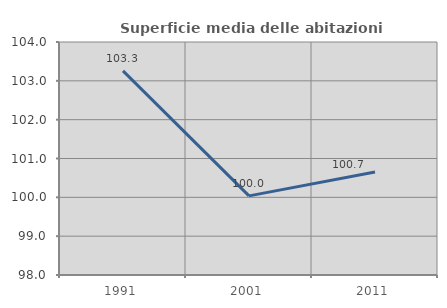
| Category | Superficie media delle abitazioni occupate |
|---|---|
| 1991.0 | 103.256 |
| 2001.0 | 100.037 |
| 2011.0 | 100.651 |